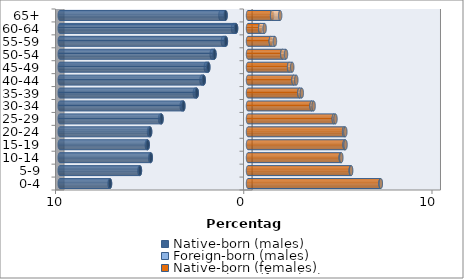
| Category | Native-born (males) | Foreign-born (males) | Native-born (females) | Foreign-born (females) |
|---|---|---|---|---|
| 0-4 | -7.331 | -0.019 | 7.039 | 0.017 |
| 5-9 | -5.741 | -0.025 | 5.459 | 0.023 |
| 10-14 | -5.163 | -0.034 | 4.927 | 0.033 |
| 15-19 | -5.327 | -0.049 | 5.132 | 0.05 |
| 20-24 | -5.199 | -0.06 | 5.105 | 0.066 |
| 25-29 | -4.594 | -0.075 | 4.56 | 0.088 |
| 30-34 | -3.433 | -0.088 | 3.379 | 0.108 |
| 35-39 | -2.721 | -0.102 | 2.731 | 0.128 |
| 40-44 | -2.351 | -0.118 | 2.418 | 0.149 |
| 45-49 | -2.108 | -0.133 | 2.182 | 0.169 |
| 50-54 | -1.78 | -0.149 | 1.824 | 0.195 |
| 55-59 | -1.174 | -0.161 | 1.211 | 0.22 |
| 60-64 | -0.634 | -0.161 | 0.648 | 0.236 |
| 65+ | -1.19 | -0.275 | 1.279 | 0.43 |